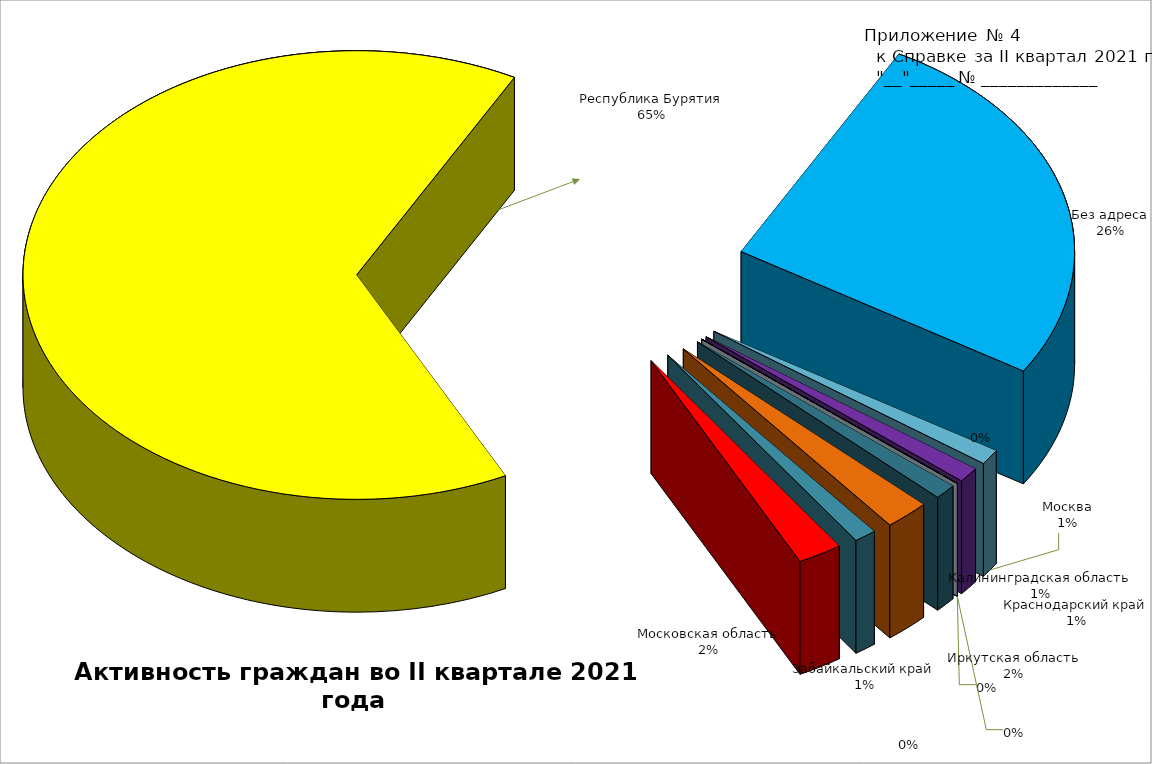
| Category | Series 1 |
|---|---|
| Калининградская область | 1 |
| Иркутская область | 2 |
| Забайкальский край | 1 |
| Московская область | 2 |
| Республика Бурятия | 60 |
| Без адреса | 24 |
| Москва | 1 |
| Краснодарский край | 1 |